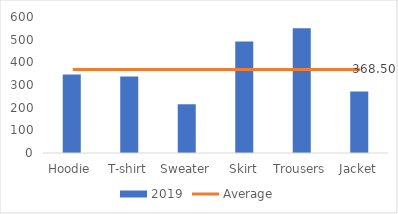
| Category | 2019 |
|---|---|
| Hoodie | 346 |
| T-shirt | 337 |
| Sweater | 215 |
| Skirt | 492 |
| Trousers | 550 |
| Jacket | 271 |